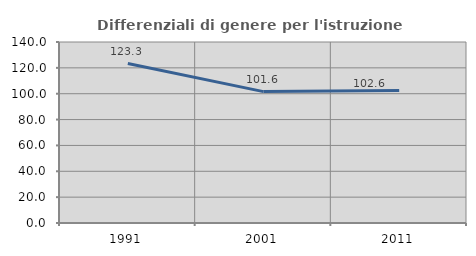
| Category | Differenziali di genere per l'istruzione superiore |
|---|---|
| 1991.0 | 123.333 |
| 2001.0 | 101.64 |
| 2011.0 | 102.565 |